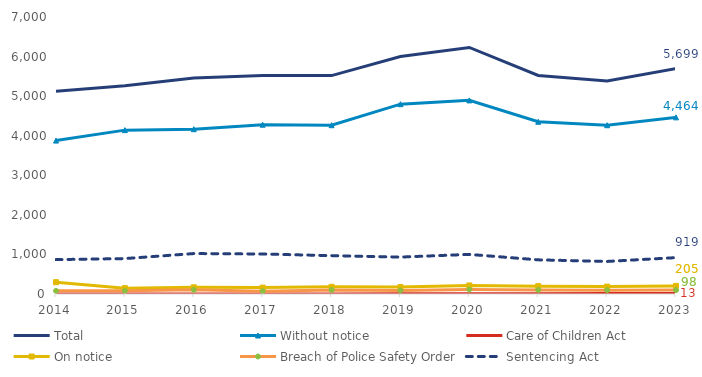
| Category | Total | Without notice | Care of Children Act | On notice | Breach of Police Safety Order | Sentencing Act |
|---|---|---|---|---|---|---|
| 2014.0 | 5123 | 3877 | 0 | 298 | 79 | 869 |
| 2015.0 | 5263 | 4141 | 0 | 148 | 79 | 895 |
| 2016.0 | 5461 | 4165 | 0 | 169 | 105 | 1022 |
| 2017.0 | 5523 | 4278 | 0 | 162 | 72 | 1011 |
| 2018.0 | 5519 | 4266 | 0 | 182 | 102 | 969 |
| 2019.0 | 6002 | 4797 | 7 | 176 | 89 | 933 |
| 2020.0 | 6230 | 4893 | 8 | 216 | 112 | 1001 |
| 2021.0 | 5522 | 4352 | 5 | 199 | 103 | 863 |
| 2022.0 | 5384 | 4265 | 12 | 187 | 97 | 823 |
| 2023.0 | 5699 | 4464 | 13 | 205 | 98 | 919 |